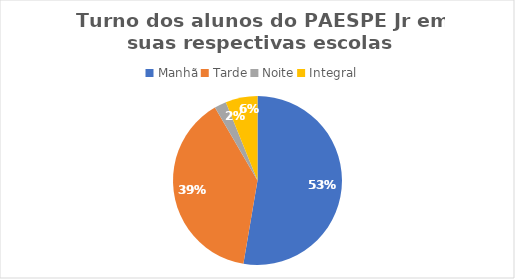
| Category | Quantidade |
|---|---|
| Manhã | 69 |
| Tarde | 51 |
| Noite | 3 |
| Integral | 8 |